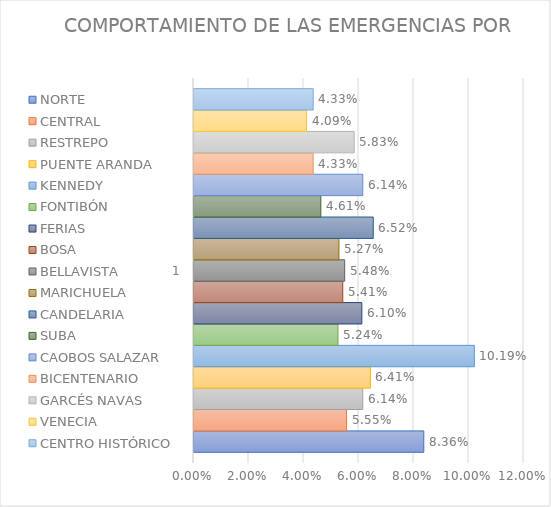
| Category | NORTE | CENTRAL | RESTREPO | PUENTE ARANDA | KENNEDY | FONTIBÓN | FERIAS | BOSA | BELLAVISTA | MARICHUELA | CANDELARIA | SUBA | CAOBOS SALAZAR | BICENTENARIO | GARCÉS NAVAS | VENECIA | CENTRO HISTÓRICO |
|---|---|---|---|---|---|---|---|---|---|---|---|---|---|---|---|---|---|
| 0 | 0.084 | 0.055 | 0.061 | 0.064 | 0.102 | 0.052 | 0.061 | 0.054 | 0.055 | 0.053 | 0.065 | 0.046 | 0.061 | 0.043 | 0.058 | 0.041 | 0.043 |